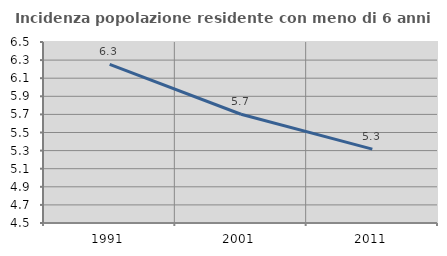
| Category | Incidenza popolazione residente con meno di 6 anni |
|---|---|
| 1991.0 | 6.252 |
| 2001.0 | 5.702 |
| 2011.0 | 5.317 |